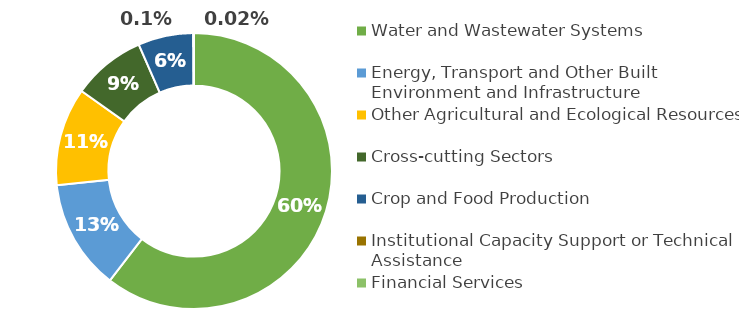
| Category | Series 0 |
|---|---|
| Water and Wastewater Systems | 459813810 |
| Energy, Transport and Other Built Environment and Infrastructure | 98362272.656 |
| Other Agricultural and Ecological Resources | 87494937.2 |
| Cross-cutting Sectors | 65437636.26 |
| Crop and Food Production | 49250000 |
| Institutional Capacity Support or Technical Assistance | 459000 |
| Financial Services | 150000 |